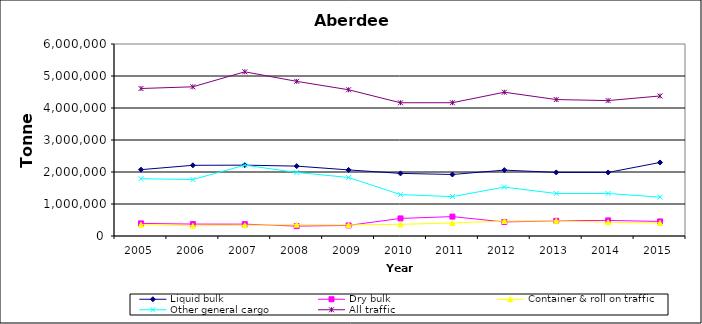
| Category | Liquid bulk | Dry bulk | Container & roll on traffic | Other general cargo | All traffic |
|---|---|---|---|---|---|
| 2005.0 | 2073000 | 394000 | 354000 | 1790000 | 4609000 |
| 2006.0 | 2209000 | 373000 | 317000 | 1765000 | 4663000 |
| 2007.0 | 2214000 | 371000 | 334000 | 2213000 | 5131000 |
| 2008.0 | 2184000 | 308000 | 355000 | 1986000 | 4833000 |
| 2009.0 | 2065366 | 330706 | 345168 | 1828821 | 4570061 |
| 2010.0 | 1957000 | 549000 | 365000 | 1293000 | 4164000 |
| 2011.0 | 1922000 | 606000 | 405000 | 1231000 | 4165000 |
| 2012.0 | 2059000 | 439000 | 468000 | 1527000 | 4493000 |
| 2013.0 | 1987000 | 474000 | 474000 | 1329000 | 4264000 |
| 2014.0 | 1986000 | 487000 | 430000 | 1328000 | 4231000 |
| 2015.0 | 2298000 | 455000 | 408000 | 1215000 | 4376000 |